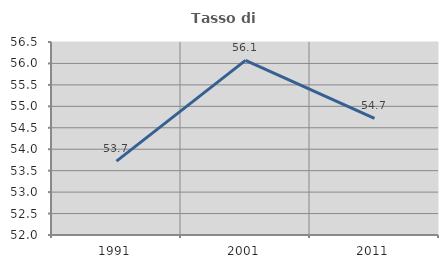
| Category | Tasso di occupazione   |
|---|---|
| 1991.0 | 53.721 |
| 2001.0 | 56.073 |
| 2011.0 | 54.721 |